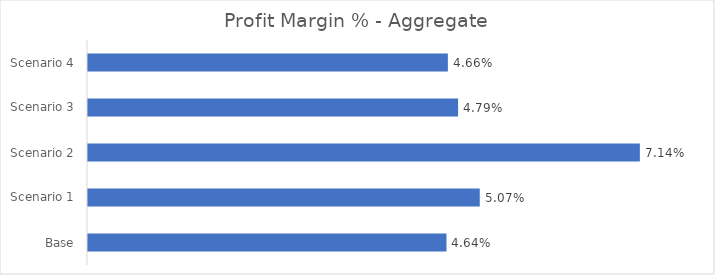
| Category | Series 0 |
|---|---|
| Base | 0.046 |
| Scenario 1 | 0.051 |
| Scenario 2 | 0.071 |
| Scenario 3 | 0.048 |
| Scenario 4 | 0.047 |